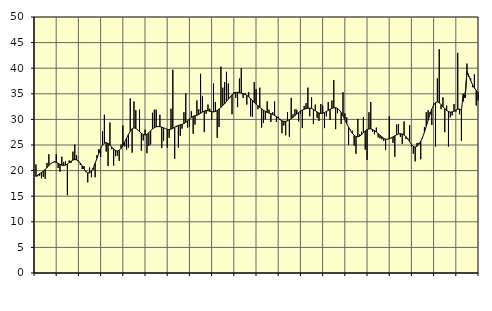
| Category | Piggar | Series 1 |
|---|---|---|
| nan | 21.2 | 18.84 |
| 1.0 | 18.9 | 19.13 |
| 1.0 | 19 | 19.39 |
| 1.0 | 18.5 | 19.61 |
| 1.0 | 18.8 | 19.9 |
| 1.0 | 18.4 | 20.23 |
| 1.0 | 21.5 | 20.57 |
| 1.0 | 23.2 | 20.98 |
| 1.0 | 21.4 | 21.34 |
| 1.0 | 21.6 | 21.59 |
| 1.0 | 21.8 | 21.68 |
| 1.0 | 23.2 | 21.61 |
| nan | 20.5 | 21.43 |
| 2.0 | 19.8 | 21.22 |
| 2.0 | 22.7 | 21.06 |
| 2.0 | 21.7 | 21 |
| 2.0 | 21.8 | 21.07 |
| 2.0 | 15.2 | 21.28 |
| 2.0 | 22 | 21.55 |
| 2.0 | 21.5 | 21.84 |
| 2.0 | 23.7 | 22.05 |
| 2.0 | 25.1 | 22.16 |
| 2.0 | 23 | 22.1 |
| 2.0 | 21.9 | 21.86 |
| nan | 21.1 | 21.45 |
| 3.0 | 20.3 | 20.92 |
| 3.0 | 20.9 | 20.34 |
| 3.0 | 19.7 | 19.83 |
| 3.0 | 17.7 | 19.54 |
| 3.0 | 20.6 | 19.56 |
| 3.0 | 18.7 | 19.9 |
| 3.0 | 20.2 | 20.55 |
| 3.0 | 18.7 | 21.42 |
| 3.0 | 23 | 22.41 |
| 3.0 | 24.2 | 23.42 |
| 3.0 | 22.7 | 24.31 |
| nan | 27.7 | 24.98 |
| 4.0 | 30.9 | 25.37 |
| 4.0 | 23.7 | 25.46 |
| 4.0 | 20.9 | 25.32 |
| 4.0 | 29.4 | 24.99 |
| 4.0 | 24.2 | 24.58 |
| 4.0 | 21 | 24.19 |
| 4.0 | 22.8 | 23.92 |
| 4.0 | 22.9 | 23.84 |
| 4.0 | 21.9 | 23.97 |
| 4.0 | 25.1 | 24.33 |
| 4.0 | 28.8 | 24.89 |
| nan | 24.7 | 25.59 |
| 5.0 | 24.1 | 26.33 |
| 5.0 | 24.5 | 27.06 |
| 5.0 | 34.1 | 27.71 |
| 5.0 | 23.5 | 28.16 |
| 5.0 | 33.5 | 28.33 |
| 5.0 | 31.8 | 28.25 |
| 5.0 | 28 | 27.98 |
| 5.0 | 31.9 | 27.62 |
| 5.0 | 23.9 | 27.27 |
| 5.0 | 25.9 | 27.04 |
| 5.0 | 28 | 26.96 |
| nan | 23.4 | 27.08 |
| 6.0 | 24.8 | 27.39 |
| 6.0 | 25.1 | 27.79 |
| 6.0 | 31.3 | 28.14 |
| 6.0 | 31.9 | 28.39 |
| 6.0 | 31.9 | 28.55 |
| 6.0 | 28.6 | 28.61 |
| 6.0 | 30.9 | 28.58 |
| 6.0 | 24.4 | 28.49 |
| 6.0 | 25.8 | 28.35 |
| 6.0 | 28.2 | 28.2 |
| 6.0 | 24.5 | 28.07 |
| nan | 26.4 | 28.03 |
| 7.0 | 32.1 | 28.09 |
| 7.0 | 39.7 | 28.26 |
| 7.0 | 22.3 | 28.48 |
| 7.0 | 28.5 | 28.68 |
| 7.0 | 24.5 | 28.82 |
| 7.0 | 26.8 | 28.94 |
| 7.0 | 28.2 | 29.04 |
| 7.0 | 31.4 | 29.19 |
| 7.0 | 35.1 | 29.43 |
| 7.0 | 28.4 | 29.73 |
| 7.0 | 28.6 | 30.05 |
| nan | 31.6 | 30.37 |
| 8.0 | 27.2 | 30.61 |
| 8.0 | 29 | 30.72 |
| 8.0 | 33.7 | 30.8 |
| 8.0 | 32 | 30.96 |
| 8.0 | 38.9 | 31.18 |
| 8.0 | 34.5 | 31.43 |
| 8.0 | 27.5 | 31.63 |
| 8.0 | 31.1 | 31.73 |
| 8.0 | 32.9 | 31.7 |
| 8.0 | 32.1 | 31.59 |
| 8.0 | 29.9 | 31.5 |
| nan | 37 | 31.47 |
| 9.0 | 33.4 | 31.55 |
| 9.0 | 26.4 | 31.75 |
| 9.0 | 28.5 | 32.04 |
| 9.0 | 40.3 | 32.35 |
| 9.0 | 36.2 | 32.7 |
| 9.0 | 37.3 | 33.08 |
| 9.0 | 39.3 | 33.5 |
| 9.0 | 37 | 33.95 |
| 9.0 | 34.3 | 34.39 |
| 9.0 | 31 | 34.79 |
| 9.0 | 35.3 | 35.1 |
| nan | 34.2 | 35.27 |
| 10.0 | 32.4 | 35.29 |
| 10.0 | 38 | 35.23 |
| 10.0 | 40 | 35.14 |
| 10.0 | 34.2 | 35.03 |
| 10.0 | 35.1 | 34.89 |
| 10.0 | 32.9 | 34.67 |
| 10.0 | 35.3 | 34.4 |
| 10.0 | 30.6 | 34.06 |
| 10.0 | 30.5 | 33.69 |
| 10.0 | 37.3 | 33.32 |
| 10.0 | 35.9 | 32.98 |
| nan | 32 | 32.66 |
| 11.0 | 36.2 | 32.35 |
| 11.0 | 28.4 | 32.07 |
| 11.0 | 29.3 | 31.8 |
| 11.0 | 30 | 31.56 |
| 11.0 | 33.5 | 31.38 |
| 11.0 | 31.9 | 31.24 |
| 11.0 | 29.5 | 31.11 |
| 11.0 | 31.4 | 30.96 |
| 11.0 | 33.5 | 30.78 |
| 11.0 | 29.5 | 30.54 |
| 11.0 | 30.5 | 30.24 |
| nan | 30.1 | 29.94 |
| 12.0 | 27.3 | 29.72 |
| 12.0 | 28.8 | 29.61 |
| 12.0 | 26.9 | 29.63 |
| 12.0 | 31.4 | 29.74 |
| 12.0 | 26.6 | 29.92 |
| 12.0 | 34.2 | 30.15 |
| 12.0 | 31 | 30.43 |
| 12.0 | 32 | 30.74 |
| 12.0 | 31.9 | 31.06 |
| 12.0 | 29.6 | 31.35 |
| 12.0 | 31.1 | 31.62 |
| nan | 28.3 | 31.82 |
| 13.0 | 32.6 | 31.98 |
| 13.0 | 33.2 | 32.11 |
| 13.0 | 36.2 | 32.18 |
| 13.0 | 30.6 | 32.2 |
| 13.0 | 34.3 | 32.13 |
| 13.0 | 29.1 | 31.95 |
| 13.0 | 32.9 | 31.7 |
| 13.0 | 30.3 | 31.45 |
| 13.0 | 29.7 | 31.25 |
| 13.0 | 33 | 31.17 |
| 13.0 | 32.7 | 31.21 |
| nan | 28.3 | 31.34 |
| 14.0 | 30.6 | 31.54 |
| 14.0 | 33.4 | 31.77 |
| 14.0 | 29.9 | 31.99 |
| 14.0 | 33.7 | 32.17 |
| 14.0 | 37.7 | 32.27 |
| 14.0 | 28.1 | 32.28 |
| 14.0 | 31.2 | 32.15 |
| 14.0 | 31.8 | 31.83 |
| 14.0 | 29.1 | 31.34 |
| 14.0 | 35.3 | 30.68 |
| 14.0 | 31.2 | 29.92 |
| nan | 30.4 | 29.17 |
| 15.0 | 25 | 28.48 |
| 15.0 | 28 | 27.84 |
| 15.0 | 27.8 | 27.3 |
| 15.0 | 24.9 | 26.89 |
| 15.0 | 23.3 | 26.64 |
| 15.0 | 30.1 | 26.58 |
| 15.0 | 27.1 | 26.72 |
| 15.0 | 27.6 | 27.01 |
| 15.0 | 30.4 | 27.37 |
| 15.0 | 24.1 | 27.73 |
| 15.0 | 22.1 | 28.01 |
| nan | 31.4 | 28.15 |
| 16.0 | 33.4 | 28.14 |
| 16.0 | 27.6 | 28.02 |
| 16.0 | 27.1 | 27.81 |
| 16.0 | 28.4 | 27.54 |
| 16.0 | 26.5 | 27.22 |
| 16.0 | 26.3 | 26.89 |
| 16.0 | 26.1 | 26.58 |
| 16.0 | 25.8 | 26.32 |
| 16.0 | 24 | 26.15 |
| 16.0 | 26.2 | 26.12 |
| 16.0 | 30.6 | 26.21 |
| nan | 26.3 | 26.38 |
| 17.0 | 25.4 | 26.58 |
| 17.0 | 22.7 | 26.79 |
| 17.0 | 29 | 26.99 |
| 17.0 | 29.1 | 27.14 |
| 17.0 | 26.6 | 27.2 |
| 17.0 | 25.2 | 27.15 |
| 17.0 | 29.6 | 26.96 |
| 17.0 | 26.2 | 26.63 |
| 17.0 | 26.3 | 26.16 |
| 17.0 | 28.9 | 25.63 |
| 17.0 | 24.7 | 25.11 |
| nan | 23.3 | 24.72 |
| 18.0 | 21.8 | 24.59 |
| 18.0 | 25.4 | 24.75 |
| 18.0 | 25.4 | 25.14 |
| 18.0 | 22.2 | 25.73 |
| 18.0 | 26.3 | 26.51 |
| 18.0 | 28.5 | 27.5 |
| 18.0 | 31.4 | 28.63 |
| 18.0 | 31.8 | 29.82 |
| 18.0 | 31.4 | 31 |
| 18.0 | 28.9 | 32.03 |
| 18.0 | 33.1 | 32.8 |
| nan | 24.7 | 33.29 |
| 19.0 | 38 | 33.42 |
| 19.0 | 43.7 | 33.25 |
| 19.0 | 32 | 32.89 |
| 19.0 | 34.3 | 32.48 |
| 19.0 | 27.5 | 32.09 |
| 19.0 | 32.7 | 31.76 |
| 19.0 | 24.7 | 31.54 |
| 19.0 | 30.4 | 31.43 |
| 19.0 | 30.8 | 31.46 |
| 19.0 | 33 | 31.61 |
| 19.0 | 31.5 | 31.82 |
| nan | 43 | 32 |
| 20.0 | 31 | 32.03 |
| 20.0 | 25.8 | 31.77 |
| 20.0 | 33.5 | 34.99 |
| 20.0 | 35.3 | 34.23 |
| 20.0 | 40.9 | 39.39 |
| 20.0 | 38.3 | 38.46 |
| 20.0 | 38 | 37.57 |
| 20.0 | 36.3 | 36.8 |
| 20.0 | 38.8 | 36.16 |
| 20.0 | 32.7 | 35.65 |
| 20.0 | 33.7 | 35.28 |